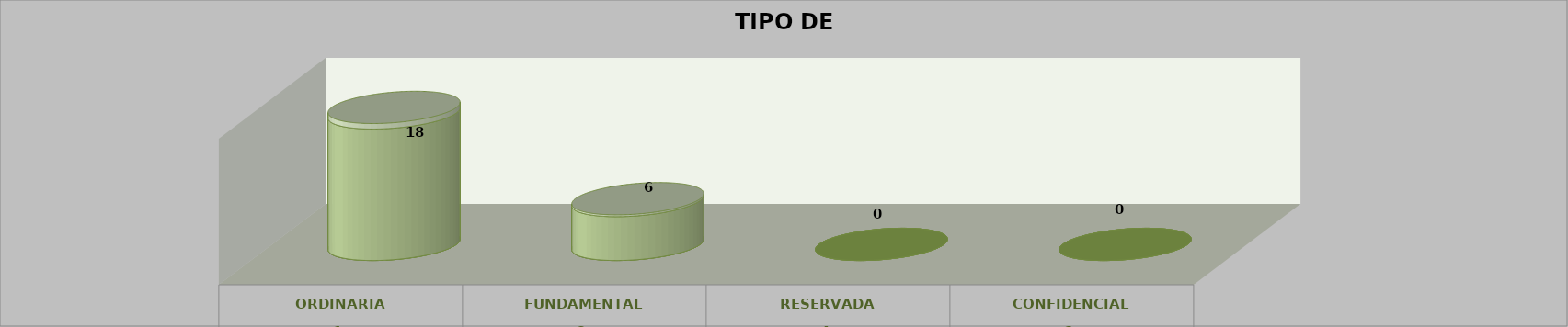
| Category | Series 0 | Series 2 | Series 1 | Series 3 | Series 4 |
|---|---|---|---|---|---|
| 0 |  |  |  | 18 | 0.75 |
| 1 |  |  |  | 6 | 0.25 |
| 2 |  |  |  | 0 | 0 |
| 3 |  |  |  | 0 | 0 |